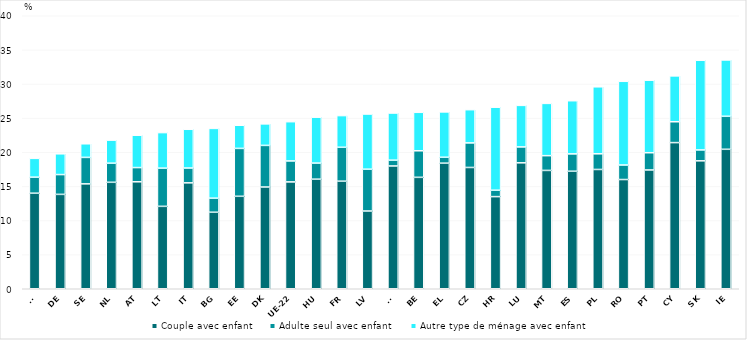
| Category | Couple avec enfant | Adulte seul avec enfant  | Autre type de ménage avec enfant |
|---|---|---|---|
| FI | 13.999 | 2.349 | 2.759 |
| DE | 13.829 | 2.9 | 3.044 |
| SE | 15.368 | 3.878 | 1.995 |
| NL | 15.598 | 2.801 | 3.379 |
| AT | 15.672 | 2.084 | 4.735 |
| LT | 12.075 | 5.597 | 5.21 |
| IT | 15.517 | 2.172 | 5.677 |
| BG | 11.211 | 2.058 | 10.226 |
| EE | 13.548 | 7.016 | 3.391 |
| DK | 14.908 | 6.096 | 3.154 |
| UE-22 | 15.659 | 3.069 | 5.752 |
| HU | 16.053 | 2.36 | 6.722 |
| FR | 15.761 | 4.967 | 4.643 |
| LV | 11.39 | 6.127 | 8.085 |
| SI | 17.991 | 0.85 | 6.907 |
| BE | 16.324 | 3.893 | 5.636 |
| EL | 18.4 | 0.866 | 6.645 |
| CZ | 17.77 | 3.6 | 4.868 |
| HR | 13.499 | 0.938 | 12.164 |
| LU | 18.452 | 2.33 | 6.088 |
| MT | 17.338 | 2.161 | 7.662 |
| ES | 17.22 | 2.54 | 7.791 |
| PL | 17.479 | 2.295 | 9.817 |
| RO | 16.005 | 2.126 | 12.264 |
| PT | 17.404 | 2.527 | 10.627 |
| CY | 21.414 | 3.055 | 6.721 |
| SK | 18.741 | 1.598 | 13.136 |
| IE | 20.434 | 4.837 | 8.253 |